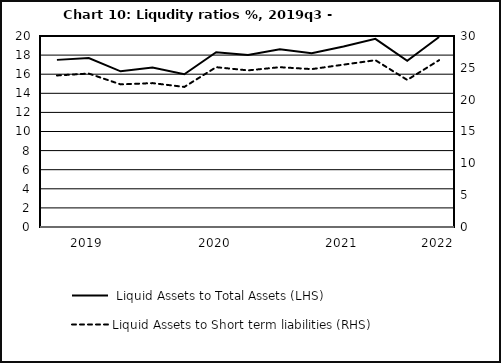
| Category |  Liquid Assets to Total Assets (LHS) |
|---|---|
| nan | 17.5 |
| 2019.0 | 17.7 |
| nan | 16.3 |
| nan | 16.7 |
| nan | 16 |
| 2020.0 | 18.3 |
| nan | 18 |
| nan | 18.6 |
| nan | 18.2 |
| 2021.0 | 18.9 |
| nan | 19.7 |
| nan | 17.4 |
| 2022.0 | 19.9 |